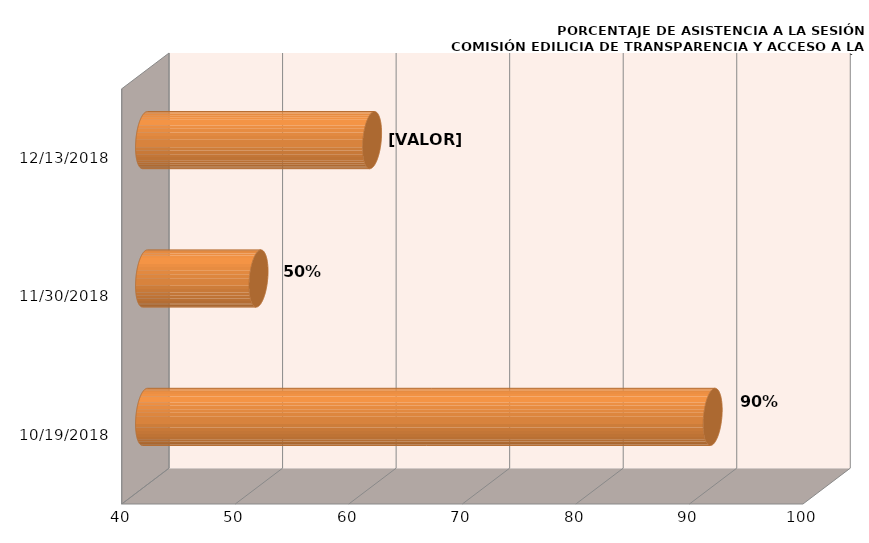
| Category | Series 0 |
|---|---|
| 19/10/2018 | 90 |
| 30/11/2018 | 50 |
| 13/12/2018 | 60 |